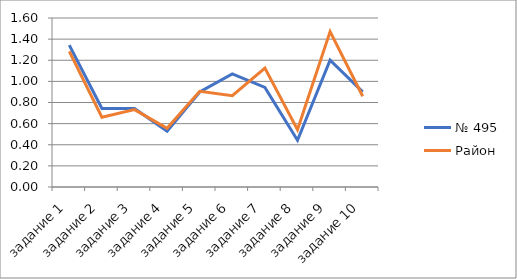
| Category | № 495 | Район |
|---|---|---|
| задание 1 | 1.343 | 1.284 |
| задание 2 | 0.743 | 0.661 |
| задание 3 | 0.743 | 0.733 |
| задание 4 | 0.529 | 0.555 |
| задание 5 | 0.9 | 0.906 |
| задание 6 | 1.071 | 0.865 |
| задание 7 | 0.943 | 1.127 |
| задание 8 | 0.443 | 0.543 |
| задание 9 | 1.2 | 1.472 |
| задание 10 | 0.9 | 0.859 |